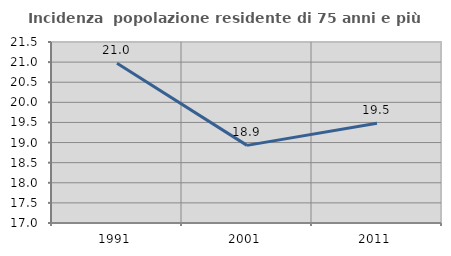
| Category | Incidenza  popolazione residente di 75 anni e più |
|---|---|
| 1991.0 | 20.974 |
| 2001.0 | 18.93 |
| 2011.0 | 19.481 |